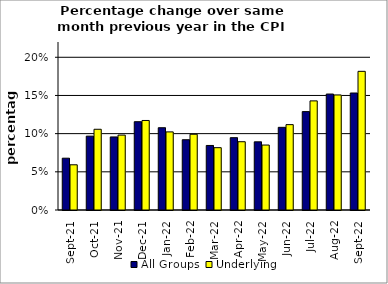
| Category | All Groups | Underlying |
|---|---|---|
| 2021-09-01 | 0.068 | 0.059 |
| 2021-10-01 | 0.097 | 0.106 |
| 2021-11-01 | 0.096 | 0.098 |
| 2021-12-01 | 0.116 | 0.117 |
| 2022-01-01 | 0.108 | 0.102 |
| 2022-02-01 | 0.092 | 0.099 |
| 2022-03-01 | 0.085 | 0.082 |
| 2022-04-01 | 0.095 | 0.089 |
| 2022-05-01 | 0.089 | 0.085 |
| 2022-06-01 | 0.108 | 0.112 |
| 2022-07-01 | 0.129 | 0.143 |
| 2022-08-01 | 0.152 | 0.151 |
| 2022-09-01 | 0.153 | 0.182 |